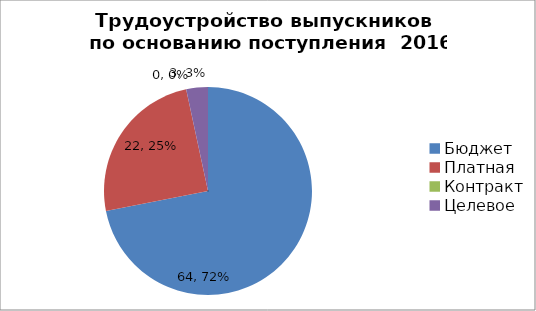
| Category | 2017 г. |
|---|---|
| Бюджет | 64 |
| Платная | 22 |
| Контракт | 0 |
| Целевое | 3 |